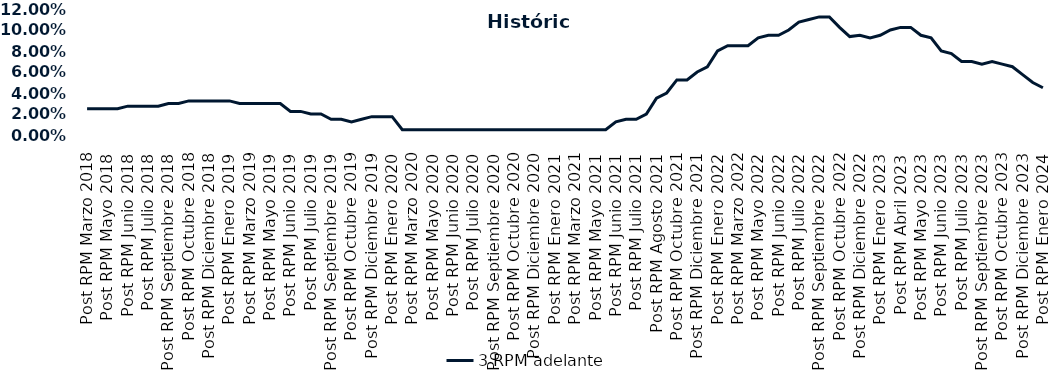
| Category | 3 RPM adelante |
|---|---|
| Post RPM Marzo 2018 | 0.025 |
| Pre RPM Mayo 2018 | 0.025 |
| Post RPM Mayo 2018 | 0.025 |
| Pre RPM Junio 2018 | 0.025 |
| Post RPM Junio 2018 | 0.028 |
| Pre RPM Julio 2018 | 0.028 |
| Post RPM Julio 2018 | 0.028 |
| Pre RPM Septiembre 2018 | 0.028 |
| Post RPM Septiembre 2018 | 0.03 |
| Pre RPM Octubre 2018 | 0.03 |
| Post RPM Octubre 2018 | 0.032 |
| Pre RPM Diciembre 2018 | 0.032 |
| Post RPM Diciembre 2018 | 0.032 |
| Pre RPM Enero 2019 | 0.032 |
| Post RPM Enero 2019 | 0.032 |
| Pre RPM Marzo 2019 | 0.03 |
| Post RPM Marzo 2019 | 0.03 |
| Pre RPM Mayo 2019 | 0.03 |
| Post RPM Mayo 2019 | 0.03 |
| Pre RPM Junio 2019 | 0.03 |
| Post RPM Junio 2019 | 0.022 |
| Pre RPM Julio 2019 | 0.022 |
| Post RPM Julio 2019 | 0.02 |
| Pre RPM Septiembre 2019 | 0.02 |
| Post RPM Septiembre 2019 | 0.015 |
| Pre RPM Octubre 2019 | 0.015 |
| Post RPM Octubre 2019 | 0.012 |
| Pre RPM Diciembre 2019 | 0.015 |
| Post RPM Diciembre 2019 | 0.018 |
| Pre RPM Enero 2020 | 0.018 |
| Post RPM Enero 2020 | 0.018 |
| Pre RPM Marzo 2020 | 0.005 |
| Post RPM Marzo 2020 | 0.005 |
| Pre RPM Mayo 2020 | 0.005 |
| Post RPM Mayo 2020 | 0.005 |
| Pre RPM Junio 2020 | 0.005 |
| Post RPM Junio 2020 | 0.005 |
| Pre RPM Julio 2020 | 0.005 |
| Post RPM Julio 2020 | 0.005 |
| Pre RPM Septiembre 2020 | 0.005 |
| Post RPM Septiembre 2020 | 0.005 |
| Pre RPM Octubre 2020 | 0.005 |
| Post RPM Octubre 2020 | 0.005 |
| Pre RPM Diciembre 2020 | 0.005 |
| Post RPM Diciembre 2020 | 0.005 |
| Pre RPM Enero 2021 | 0.005 |
| Post RPM Enero 2021 | 0.005 |
| Pre RPM Marzo 2021 | 0.005 |
| Post RPM Marzo 2021 | 0.005 |
| Pre RPM Mayo 2021 | 0.005 |
| Post RPM Mayo 2021 | 0.005 |
| Pre RPM Junio 2021 | 0.005 |
| Post RPM Junio 2021 | 0.012 |
| Pre RPM Julio 2021 | 0.015 |
| Post RPM Julio 2021 | 0.015 |
| Pre RPM Agosto 2021 | 0.02 |
| Post RPM Agosto 2021 | 0.035 |
| Pre RPM Octubre 2021 | 0.04 |
| Post RPM Octubre 2021 | 0.052 |
| Pre RPM Diciembre 2021 | 0.052 |
| Post RPM Diciembre 2021 | 0.06 |
| Pre RPM Enero 2022 | 0.065 |
| Post RPM Enero 2022 | 0.08 |
| Pre RPM Marzo 2022 | 0.085 |
| Post RPM Marzo 2022 | 0.085 |
| Pre RPM Mayo 2022 | 0.085 |
| Post RPM Mayo 2022 | 0.092 |
| Pre RPM Junio 2022 | 0.095 |
| Post RPM Junio 2022 | 0.095 |
| Pre RPM Julio 2022 | 0.1 |
| Post RPM Julio 2022 | 0.108 |
| Pre RPM Septiembre 2022 | 0.11 |
| Post RPM Septiembre 2022 | 0.112 |
| Pre RPM Octubre 2022 | 0.112 |
| Post RPM Octubre 2022 | 0.102 |
| Pre RPM Diciembre 2022 | 0.094 |
| Post RPM Diciembre 2022 | 0.095 |
| Pre RPM Enero 2023 | 0.092 |
| Post RPM Enero 2023 | 0.095 |
| Pre RPM Abril 2023 | 0.1 |
| Post RPM Abril 2023 | 0.102 |
| Pre RPM Mayo 2023 | 0.102 |
| Post RPM Mayo 2023 | 0.095 |
| Pre RPM Junio 2023 | 0.092 |
| Post RPM Junio 2023 | 0.08 |
| Pre RPM Julio 2023 | 0.078 |
| Post RPM Julio 2023 | 0.07 |
| Pre RPM Septiembre 2023 | 0.07 |
| Post RPM Septiembre 2023 | 0.068 |
| Pre RPM Octubre 2023 | 0.07 |
| Post RPM Octubre 2023 | 0.068 |
| Pre RPM Diciembre 2023 | 0.065 |
| Post RPM Diciembre 2023 | 0.058 |
| Pre RPM Enero 2024 | 0.05 |
| Post RPM Enero 2024 | 0.045 |